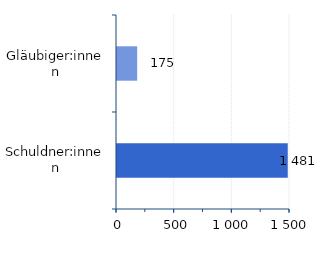
| Category | Series 0 |
|---|---|
| Gläubiger:innen | 174.983 |
| Schuldner:innen | 1480.589 |